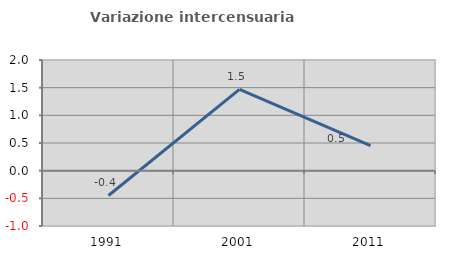
| Category | Variazione intercensuaria annua |
|---|---|
| 1991.0 | -0.449 |
| 2001.0 | 1.47 |
| 2011.0 | 0.454 |